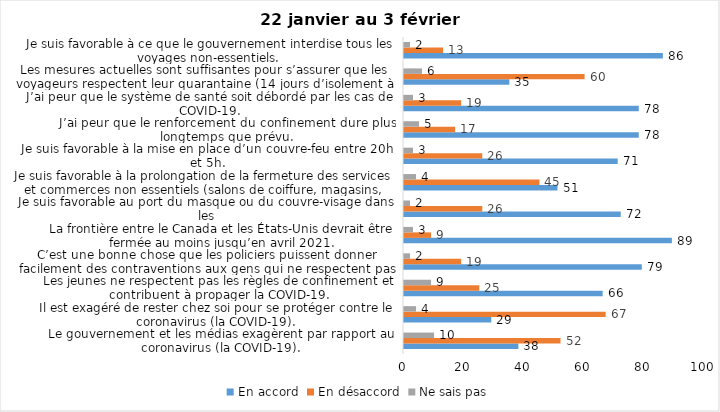
| Category | En accord | En désaccord | Ne sais pas |
|---|---|---|---|
| Le gouvernement et les médias exagèrent par rapport au coronavirus (la COVID-19). | 38 | 52 | 10 |
| Il est exagéré de rester chez soi pour se protéger contre le coronavirus (la COVID-19). | 29 | 67 | 4 |
| Les jeunes ne respectent pas les règles de confinement et contribuent à propager la COVID-19. | 66 | 25 | 9 |
| C’est une bonne chose que les policiers puissent donner facilement des contraventions aux gens qui ne respectent pas les mesures pour prévenir le coronavirus (la COVID-19). | 79 | 19 | 2 |
| La frontière entre le Canada et les États-Unis devrait être fermée au moins jusqu’en avril 2021. | 89 | 9 | 3 |
| Je suis favorable au port du masque ou du couvre-visage dans les
lieux publics extérieurs achalandés (ex. rues, parcs) | 72 | 26 | 2 |
| Je suis favorable à la prolongation de la fermeture des services et commerces non essentiels (salons de coiffure, magasins, industries) jusqu’au 8 février. | 51 | 45 | 4 |
| Je suis favorable à la mise en place d’un couvre-feu entre 20h et 5h. | 71 | 26 | 3 |
| J’ai peur que le renforcement du confinement dure plus longtemps que prévu. | 78 | 17 | 5 |
| J’ai peur que le système de santé soit débordé par les cas de COVID-19. | 78 | 19 | 3 |
| Les mesures actuelles sont suffisantes pour s’assurer que les voyageurs respectent leur quarantaine (14 jours d’isolement à la maison au retour d’un voyage). | 35 | 60 | 6 |
| Je suis favorable à ce que le gouvernement interdise tous les voyages non-essentiels. | 86 | 13 | 2 |